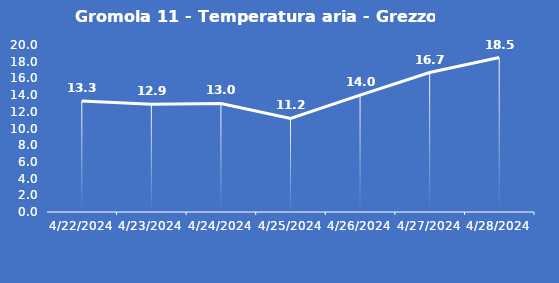
| Category | Gromola 11 - Temperatura aria - Grezzo (°C) |
|---|---|
| 4/22/24 | 13.3 |
| 4/23/24 | 12.9 |
| 4/24/24 | 13 |
| 4/25/24 | 11.2 |
| 4/26/24 | 14 |
| 4/27/24 | 16.7 |
| 4/28/24 | 18.5 |